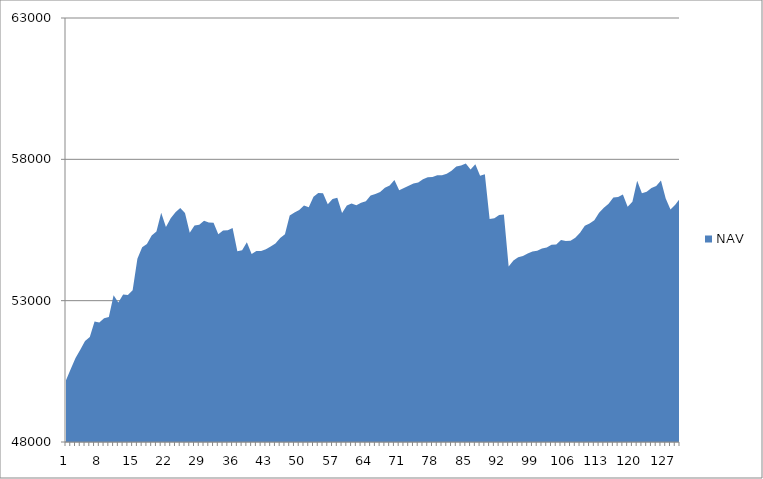
| Category | NAV |
|---|---|
| 0 | 50185.185 |
| 1 | 50585.185 |
| 2 | 50973.977 |
| 3 | 51265.977 |
| 4 | 51576.741 |
| 5 | 51711.523 |
| 6 | 52262.893 |
| 7 | 52230.24 |
| 8 | 52381.556 |
| 9 | 52425.915 |
| 10 | 53192.581 |
| 11 | 52939.146 |
| 12 | 53220.069 |
| 13 | 53197.341 |
| 14 | 53369.61 |
| 15 | 54480.721 |
| 16 | 54888.365 |
| 17 | 55001.902 |
| 18 | 55308.308 |
| 19 | 55448.308 |
| 20 | 56110.305 |
| 21 | 55610.305 |
| 22 | 55916.954 |
| 23 | 56129.798 |
| 24 | 56279.798 |
| 25 | 56105.301 |
| 26 | 55401.645 |
| 27 | 55657.201 |
| 28 | 55686.925 |
| 29 | 55823.001 |
| 30 | 55769.596 |
| 31 | 55759.375 |
| 32 | 55350.284 |
| 33 | 55480.284 |
| 34 | 55492.498 |
| 35 | 55570.42 |
| 36 | 54746.89 |
| 37 | 54783.7 |
| 38 | 55066.459 |
| 39 | 54651.074 |
| 40 | 54754.078 |
| 41 | 54760.213 |
| 42 | 54816.924 |
| 43 | 54917.296 |
| 44 | 55025.73 |
| 45 | 55220.535 |
| 46 | 55353.465 |
| 47 | 56009.309 |
| 48 | 56118.959 |
| 49 | 56205.212 |
| 50 | 56362.876 |
| 51 | 56307.394 |
| 52 | 56678.935 |
| 53 | 56813.264 |
| 54 | 56799.502 |
| 55 | 56409.112 |
| 56 | 56596.44 |
| 57 | 56640.493 |
| 58 | 56102.227 |
| 59 | 56370.449 |
| 60 | 56434.248 |
| 61 | 56376.841 |
| 62 | 56464.524 |
| 63 | 56518.022 |
| 64 | 56724.747 |
| 65 | 56770.361 |
| 66 | 56848.099 |
| 67 | 56992.896 |
| 68 | 57073.571 |
| 69 | 57266.481 |
| 70 | 56908.016 |
| 71 | 56984.939 |
| 72 | 57069.276 |
| 73 | 57147.627 |
| 74 | 57179.83 |
| 75 | 57291.17 |
| 76 | 57366.35 |
| 77 | 57371.599 |
| 78 | 57439.215 |
| 79 | 57440.895 |
| 80 | 57490.895 |
| 81 | 57593.679 |
| 82 | 57746.643 |
| 83 | 57785.413 |
| 84 | 57849.748 |
| 85 | 57639.346 |
| 86 | 57828.82 |
| 87 | 57417.055 |
| 88 | 57471.335 |
| 89 | 55888.376 |
| 90 | 55913.907 |
| 91 | 56031.989 |
| 92 | 56044.711 |
| 93 | 54210.631 |
| 94 | 54422.612 |
| 95 | 54536.647 |
| 96 | 54575.903 |
| 97 | 54670.229 |
| 98 | 54737.367 |
| 99 | 54762.386 |
| 100 | 54842.923 |
| 101 | 54881.385 |
| 102 | 54978.816 |
| 103 | 54991.283 |
| 104 | 55149.699 |
| 105 | 55109.498 |
| 106 | 55121.656 |
| 107 | 55227.569 |
| 108 | 55405.15 |
| 109 | 55650.183 |
| 110 | 55733.424 |
| 111 | 55846.244 |
| 112 | 56110.95 |
| 113 | 56283.172 |
| 114 | 56430.541 |
| 115 | 56648.489 |
| 116 | 56663.919 |
| 117 | 56752.272 |
| 118 | 56318.108 |
| 119 | 56496.442 |
| 120 | 57240.145 |
| 121 | 56797.081 |
| 122 | 56857.303 |
| 123 | 56985.874 |
| 124 | 57053.805 |
| 125 | 57249.117 |
| 126 | 56612.311 |
| 127 | 56221.507 |
| 128 | 56394.346 |
| 129 | 56622.008 |